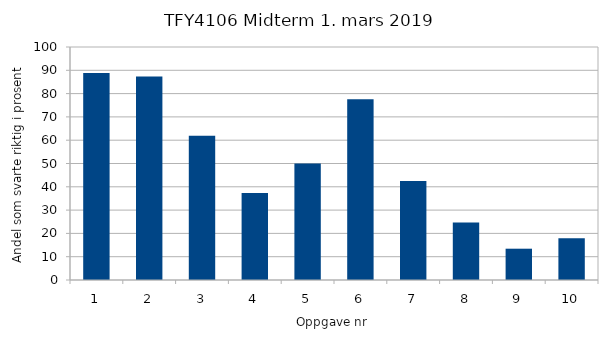
| Category | Series 0 |
|---|---|
| 0 | 88.806 |
| 1 | 87.313 |
| 2 | 61.94 |
| 3 | 37.313 |
| 4 | 50 |
| 5 | 77.612 |
| 6 | 42.537 |
| 7 | 24.627 |
| 8 | 13.433 |
| 9 | 17.91 |